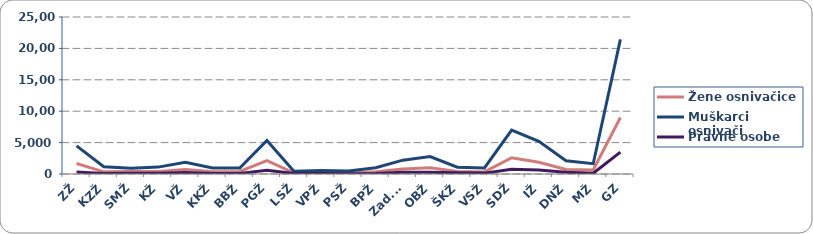
| Category | Žene osnivačice | Muškarci osnivači | Pravne osobe |
|---|---|---|---|
| ZŽ | 1671 | 4472 | 311 |
| KZŽ | 348 | 1157 | 93 |
| SMŽ | 404 | 935 | 126 |
| KŽ | 406 | 1095 | 124 |
| VŽ | 702 | 1860 | 234 |
| KKŽ | 358 | 953 | 73 |
| BBŽ | 405 | 938 | 96 |
| PGŽ | 2117 | 5332 | 598 |
| LSŽ | 160 | 419 | 62 |
| VPŽ | 168 | 575 | 71 |
| PSŽ | 142 | 463 | 47 |
| BPŽ | 361 | 995 | 99 |
| Zad.Ž. | 803 | 2203 | 280 |
| OBŽ | 981 | 2766 | 270 |
| ŠKŽ | 382 | 1085 | 196 |
| VSŽ | 336 | 958 | 141 |
| SDŽ | 2586 | 6974 | 752 |
| IŽ | 1870 | 5213 | 637 |
| DNŽ | 724 | 2096 | 275 |
| MŽ | 644 | 1636 | 112 |
| GZ | 9004 | 21440 | 3489 |